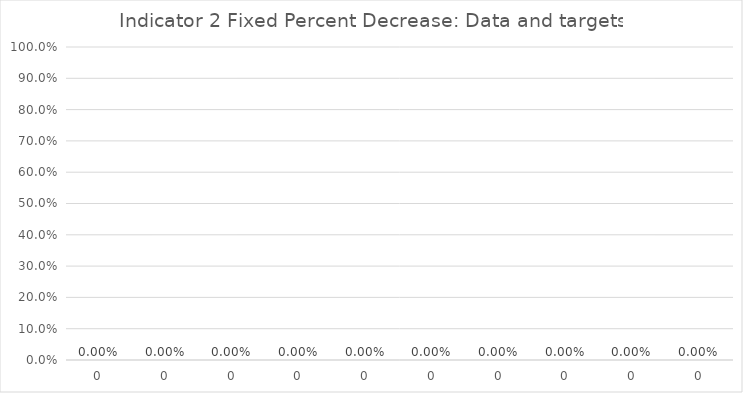
| Category | Indicator 2 data and targets |
|---|---|
| 0.0 | 0 |
| 0.0 | 0 |
| 0.0 | 0 |
| 0.0 | 0 |
| 0.0 | 0 |
| 0.0 | 0 |
| 0.0 | 0 |
| 0.0 | 0 |
| 0.0 | 0 |
| 0.0 | 0 |